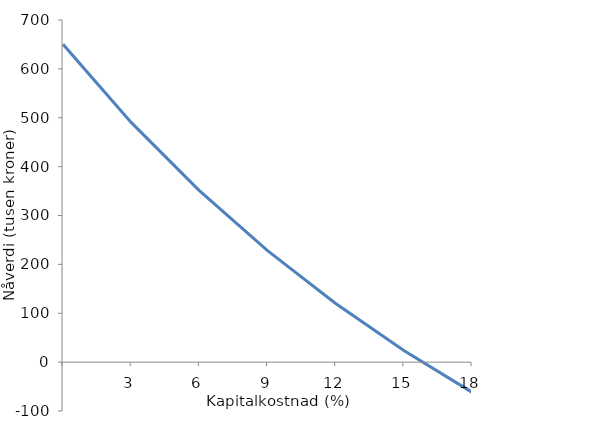
| Category | Janus |
|---|---|
| nan | 650.158 |
| 3.0 | 490.421 |
| 6.0 | 350.81 |
| 9.0 | 228.162 |
| 12.0 | 119.895 |
| 15.0 | 23.887 |
| 18.0 | -61.616 |